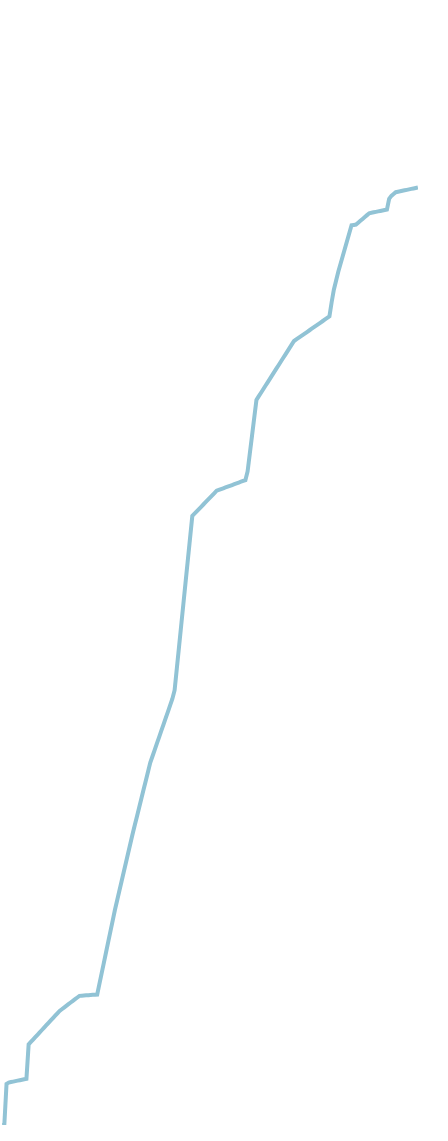
| Category | 0.094 0.452 1.490 2.913 3.908 4.383 9.535 15.625 21.715 27.805 34.143 43.437 52.158 52.266 52.374 52.482 52.590 52.827 57.813 78.451 92.148 97.582 99.944 99.963 99.985 100 |
|---|---|
| 0 | 0.003 |
| 1 | 0.005 |
| 2 | 4.387 |
| 3 | 4.531 |
| 4 | 4.581 |
| 5 | 4.631 |
| 6 | 4.681 |
| 7 | 4.731 |
| 8 | 4.781 |
| 9 | 4.831 |
| 10 | 4.881 |
| 11 | 4.931 |
| 12 | 8.603 |
| 13 | 8.858 |
| 14 | 9.113 |
| 15 | 9.368 |
| 16 | 9.623 |
| 17 | 9.878 |
| 18 | 10.133 |
| 19 | 10.388 |
| 20 | 10.643 |
| 21 | 10.898 |
| 22 | 11.153 |
| 23 | 11.408 |
| 24 | 11.663 |
| 25 | 11.918 |
| 26 | 12.171 |
| 27 | 12.35 |
| 28 | 12.529 |
| 29 | 12.708 |
| 30 | 12.887 |
| 31 | 13.066 |
| 32 | 13.245 |
| 33 | 13.424 |
| 34 | 13.603 |
| 35 | 13.778 |
| 36 | 13.796 |
| 37 | 13.814 |
| 38 | 13.832 |
| 39 | 13.85 |
| 40 | 13.868 |
| 41 | 13.886 |
| 42 | 13.904 |
| 43 | 13.918 |
| 44 | 15.046 |
| 45 | 16.173 |
| 46 | 17.3 |
| 47 | 18.427 |
| 48 | 19.554 |
| 49 | 20.681 |
| 50 | 21.808 |
| 51 | 22.935 |
| 52 | 23.948 |
| 53 | 24.961 |
| 54 | 25.974 |
| 55 | 26.987 |
| 56 | 28 |
| 57 | 29.013 |
| 58 | 30.026 |
| 59 | 31.038 |
| 60 | 31.991 |
| 61 | 32.944 |
| 62 | 33.897 |
| 63 | 34.85 |
| 64 | 35.803 |
| 65 | 36.756 |
| 66 | 37.709 |
| 67 | 38.652 |
| 68 | 39.336 |
| 69 | 40.017 |
| 70 | 40.698 |
| 71 | 41.379 |
| 72 | 42.06 |
| 73 | 42.741 |
| 74 | 43.422 |
| 75 | 44.103 |
| 76 | 44.784 |
| 77 | 45.465 |
| 78 | 46.372 |
| 79 | 48.696 |
| 80 | 51.02 |
| 81 | 53.344 |
| 82 | 55.668 |
| 83 | 57.992 |
| 84 | 60.316 |
| 85 | 62.64 |
| 86 | 64.962 |
| 87 | 65.207 |
| 88 | 65.452 |
| 89 | 65.697 |
| 90 | 65.942 |
| 91 | 66.187 |
| 92 | 66.432 |
| 93 | 66.677 |
| 94 | 66.922 |
| 95 | 67.167 |
| 96 | 67.412 |
| 97 | 67.657 |
| 98 | 67.744 |
| 99 | 67.831 |
| 100 | 67.918 |
| 101 | 68.005 |
| 102 | 68.092 |
| 103 | 68.179 |
| 104 | 68.266 |
| 105 | 68.353 |
| 106 | 68.44 |
| 107 | 68.527 |
| 108 | 68.614 |
| 109 | 68.701 |
| 110 | 68.787 |
| 111 | 69.713 |
| 112 | 71.622 |
| 113 | 73.529 |
| 114 | 75.436 |
| 115 | 77.343 |
| 116 | 77.713 |
| 117 | 78.083 |
| 118 | 78.453 |
| 119 | 78.823 |
| 120 | 79.193 |
| 121 | 79.563 |
| 122 | 79.933 |
| 123 | 80.303 |
| 124 | 80.673 |
| 125 | 81.043 |
| 126 | 81.413 |
| 127 | 81.783 |
| 128 | 82.153 |
| 129 | 82.523 |
| 130 | 82.893 |
| 131 | 83.263 |
| 132 | 83.624 |
| 133 | 83.791 |
| 134 | 83.955 |
| 135 | 84.119 |
| 136 | 84.283 |
| 137 | 84.447 |
| 138 | 84.611 |
| 139 | 84.775 |
| 140 | 84.939 |
| 141 | 85.103 |
| 142 | 85.267 |
| 143 | 85.431 |
| 144 | 85.595 |
| 145 | 85.759 |
| 146 | 85.923 |
| 147 | 86.087 |
| 148 | 86.251 |
| 149 | 87.764 |
| 150 | 89.096 |
| 151 | 90.059 |
| 152 | 91.021 |
| 153 | 91.846 |
| 154 | 92.671 |
| 155 | 93.496 |
| 156 | 94.321 |
| 157 | 95.146 |
| 158 | 95.971 |
| 159 | 96.009 |
| 160 | 96.045 |
| 161 | 96.247 |
| 162 | 96.448 |
| 163 | 96.649 |
| 164 | 96.85 |
| 165 | 97.051 |
| 166 | 97.252 |
| 167 | 97.302 |
| 168 | 97.352 |
| 169 | 97.402 |
| 170 | 97.452 |
| 171 | 97.502 |
| 172 | 97.552 |
| 173 | 97.602 |
| 174 | 97.65 |
| 175 | 98.799 |
| 176 | 99.105 |
| 177 | 99.302 |
| 178 | 99.498 |
| 179 | 99.55 |
| 180 | 99.6 |
| 181 | 99.65 |
| 182 | 99.7 |
| 183 | 99.75 |
| 184 | 99.8 |
| 185 | 99.85 |
| 186 | 99.9 |
| 187 | 99.95 |
| 188 | 100 |